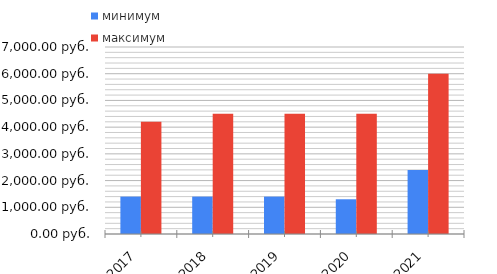
| Category | минимум | максимум |
|---|---|---|
| 2016-2017 | 1400 | 4200 |
| 2017-2018 | 1400 | 4500 |
| 2018-2019 | 1400 | 4500 |
| 2019-2020 | 1300 | 4500 |
| 2020-2021 | 2400 | 6000 |